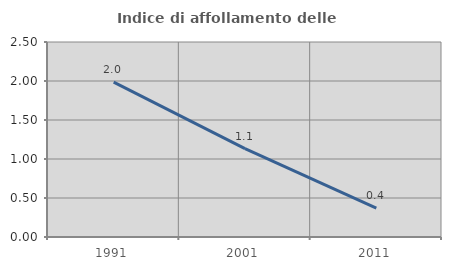
| Category | Indice di affollamento delle abitazioni  |
|---|---|
| 1991.0 | 1.984 |
| 2001.0 | 1.133 |
| 2011.0 | 0.371 |